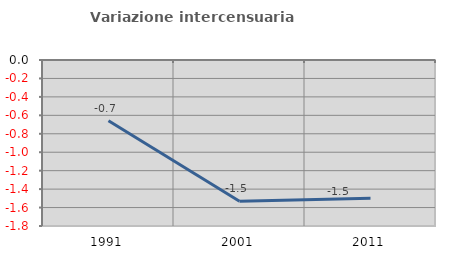
| Category | Variazione intercensuaria annua |
|---|---|
| 1991.0 | -0.659 |
| 2001.0 | -1.531 |
| 2011.0 | -1.499 |